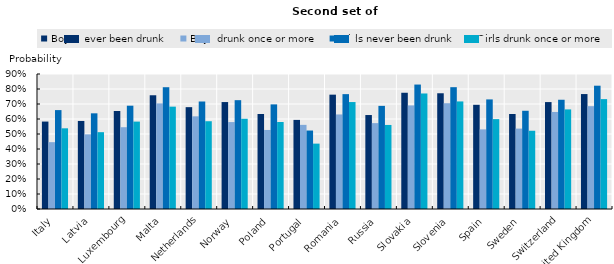
| Category | Boys never been drunk | Boys drunk once or more | Girls never been drunk | Girls drunk once or more |
|---|---|---|---|---|
| Italy | 0.583 | 0.446 | 0.659 | 0.538 |
| Latvia | 0.587 | 0.498 | 0.638 | 0.512 |
| Luxembourg | 0.653 | 0.545 | 0.689 | 0.583 |
| Malta | 0.758 | 0.704 | 0.812 | 0.682 |
| Netherlands | 0.679 | 0.618 | 0.717 | 0.585 |
| Norway | 0.713 | 0.579 | 0.726 | 0.602 |
| Poland | 0.633 | 0.527 | 0.697 | 0.58 |
| Portugal | 0.594 | 0.561 | 0.523 | 0.436 |
| Romania | 0.762 | 0.63 | 0.766 | 0.713 |
| Russia | 0.626 | 0.573 | 0.688 | 0.56 |
| Slovakia | 0.775 | 0.691 | 0.83 | 0.77 |
| Slovenia | 0.772 | 0.705 | 0.812 | 0.717 |
| Spain | 0.695 | 0.531 | 0.731 | 0.599 |
| Sweden | 0.634 | 0.536 | 0.655 | 0.522 |
| Switzerland | 0.713 | 0.647 | 0.728 | 0.664 |
| United Kingdom | 0.766 | 0.686 | 0.822 | 0.733 |